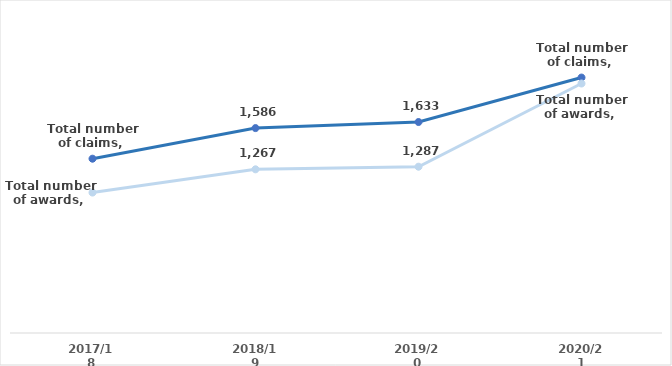
| Category | Total number of claims | Total number of awards |
|---|---|---|
| 2017/18 | 1349 | 1087 |
| 2018/19 | 1586 | 1267 |
| 2019/20 | 1633 | 1287 |
| 2020/21 | 1977 | 1931 |